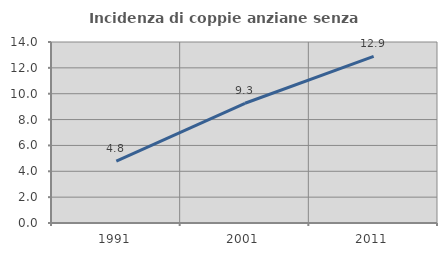
| Category | Incidenza di coppie anziane senza figli  |
|---|---|
| 1991.0 | 4.786 |
| 2001.0 | 9.262 |
| 2011.0 | 12.885 |